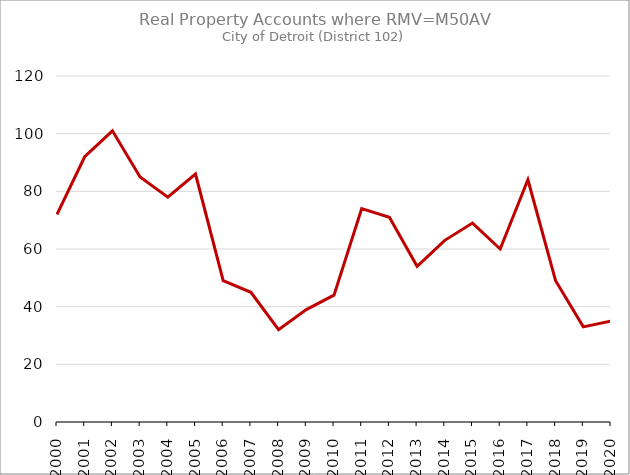
| Category | Series 0 |
|---|---|
| 2000.0 | 72 |
| 2001.0 | 92 |
| 2002.0 | 101 |
| 2003.0 | 85 |
| 2004.0 | 78 |
| 2005.0 | 86 |
| 2006.0 | 49 |
| 2007.0 | 45 |
| 2008.0 | 32 |
| 2009.0 | 39 |
| 2010.0 | 44 |
| 2011.0 | 74 |
| 2012.0 | 71 |
| 2013.0 | 54 |
| 2014.0 | 63 |
| 2015.0 | 69 |
| 2016.0 | 60 |
| 2017.0 | 84 |
| 2018.0 | 49 |
| 2019.0 | 33 |
| 2020.0 | 35 |